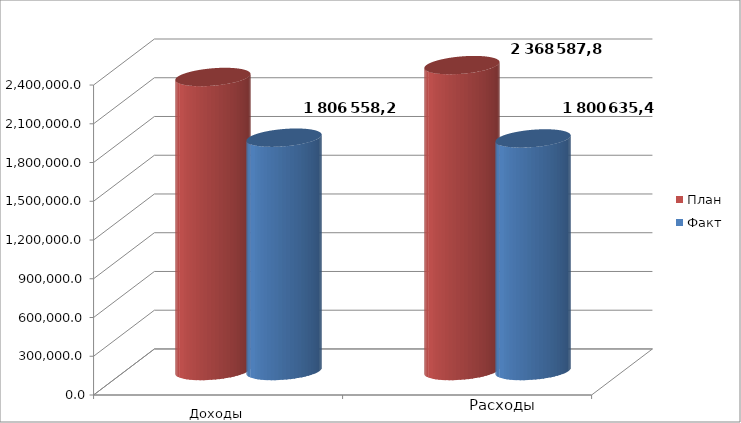
| Category | План | Факт |
|---|---|---|
| 0 | 2276608.3 | 1806558.2 |
| 1 | 2368587.8 | 1800635.4 |